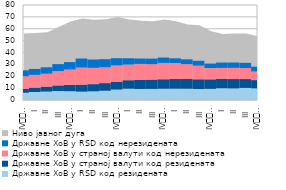
| Category | Државне ХоВ у RSD код резидената | Државне ХоВ у страној валути код резидената | Државне ХоВ у страној валути код нерезидената  | Државне ХоВ у RSD код нерезидената  |
|---|---|---|---|---|
| IV
2013. | 6.108 | 3.154 | 10.712 | 5.01 |
| I | 6.719 | 3.693 | 10.776 | 4.96 |
| II | 7.128 | 4.129 | 10.913 | 5.36 |
| III | 7.559 | 4.715 | 12.058 | 5.877 |
| IV
2014. | 7.422 | 5.345 | 12.945 | 6.191 |
| I | 7.071 | 5.857 | 14.436 | 7.542 |
| II | 7.331 | 6.037 | 13.731 | 6.995 |
| III | 7.823 | 6.394 | 13.34 | 6.803 |
| IV
2015. | 8.819 | 6.564 | 13.761 | 6.033 |
| I | 9.519 | 7.134 | 13.222 | 5.258 |
| II | 9.302 | 7.694 | 13.394 | 4.514 |
| III | 9.367 | 7.777 | 13.058 | 4.627 |
| IV
2016. | 9.497 | 7.979 | 13.754 | 4.506 |
| I | 9.526 | 8.134 | 13.489 | 3.941 |
| II | 9.502 | 8.188 | 12.532 | 4.019 |
| III | 9.291 | 8.165 | 11.493 | 4.069 |
| IV
2017. | 9.396 | 8.007 | 9.507 | 3.763 |
| I | 9.904 | 8.016 | 9.107 | 4.496 |
| II | 9.779 | 7.866 | 9.426 | 4.468 |
| III | 10.161 | 7.473 | 9.279 | 4.388 |
| IV
2018. | 9.812 | 6.953 | 7.23 | 4.052 |